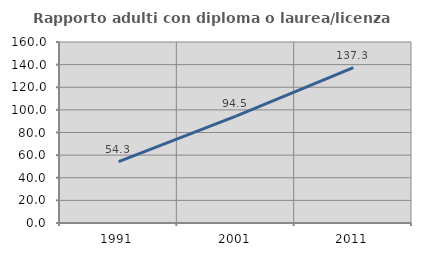
| Category | Rapporto adulti con diploma o laurea/licenza media  |
|---|---|
| 1991.0 | 54.299 |
| 2001.0 | 94.514 |
| 2011.0 | 137.298 |